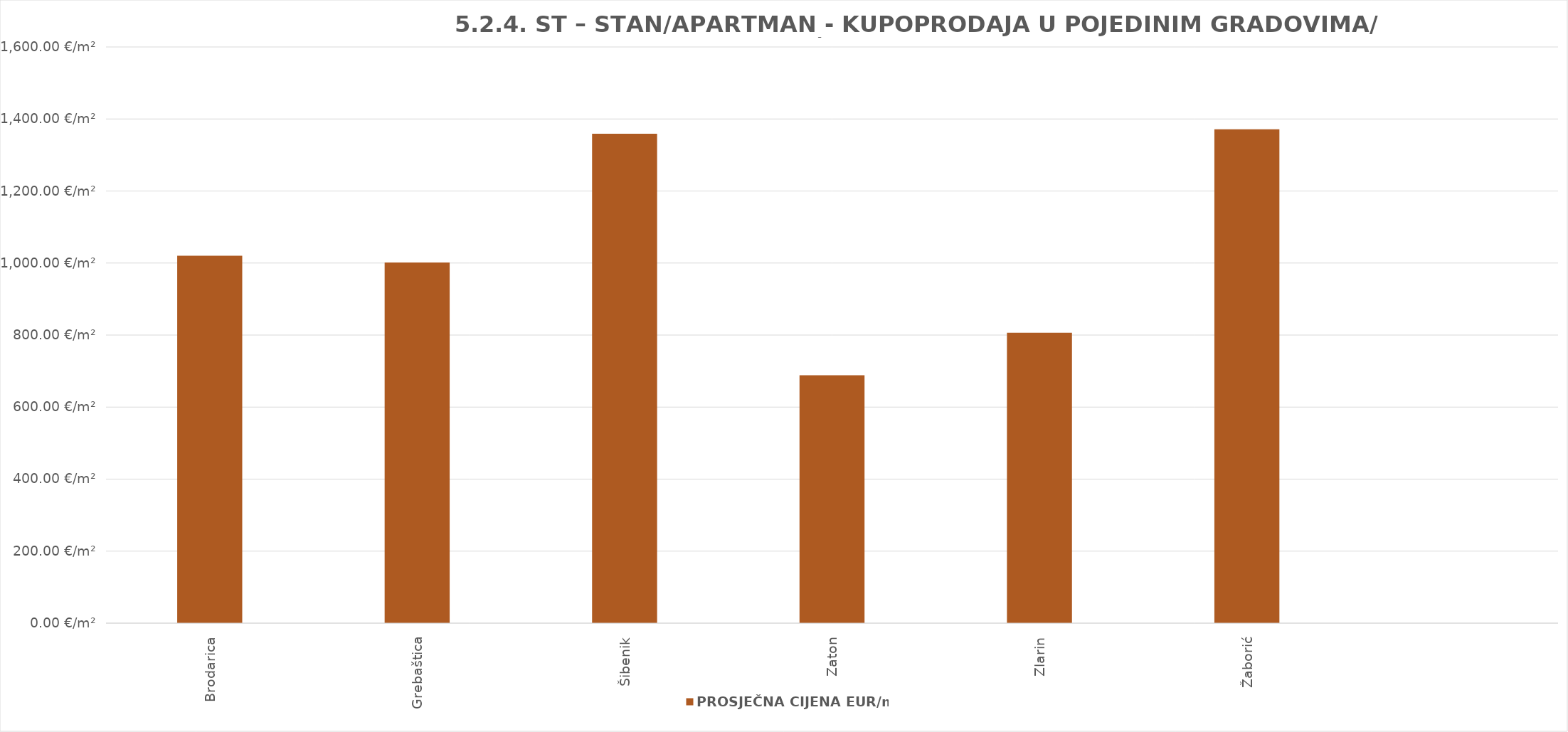
| Category | PROSJEČNA CIJENA EUR/m² |
|---|---|
| Brodarica | 1902-10-16 11:13:14 |
| Grebaštica | 1902-09-27 13:50:02 |
| Šibenik | 1903-09-19 22:13:03 |
| Zaton | 1901-11-18 05:41:44 |
| Zlarin | 1902-03-16 13:01:24 |
| Žaborić | 1903-10-02 07:23:51 |